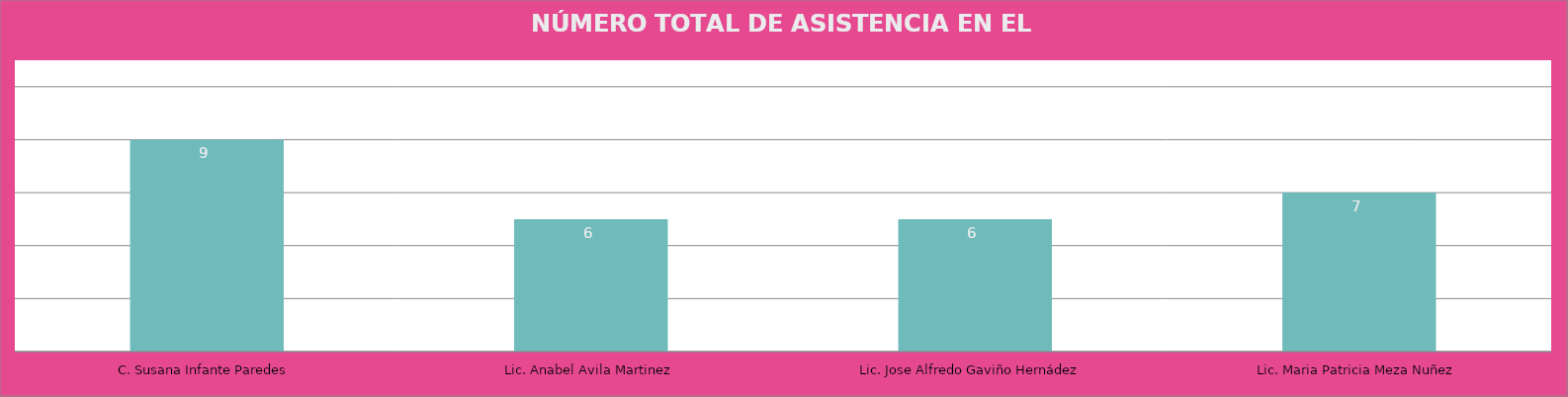
| Category | C. Susana Infante Paredes |
|---|---|
| C. Susana Infante Paredes | 9 |
| Lic. Anabel Avila Martinez | 6 |
| Lic. Jose Alfredo Gaviño Hernádez  | 6 |
| Lic. Maria Patricia Meza Nuñez | 7 |